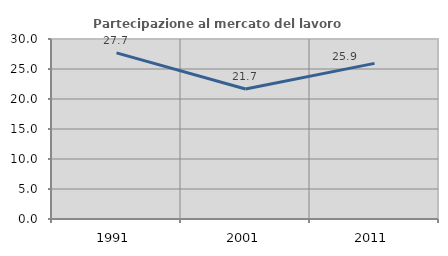
| Category | Partecipazione al mercato del lavoro  femminile |
|---|---|
| 1991.0 | 27.68 |
| 2001.0 | 21.674 |
| 2011.0 | 25.935 |